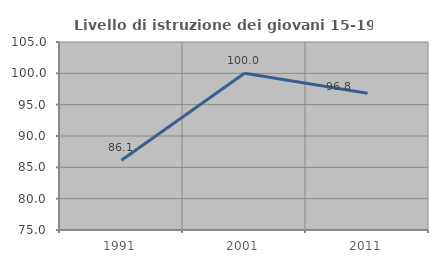
| Category | Livello di istruzione dei giovani 15-19 anni |
|---|---|
| 1991.0 | 86.139 |
| 2001.0 | 100 |
| 2011.0 | 96.825 |